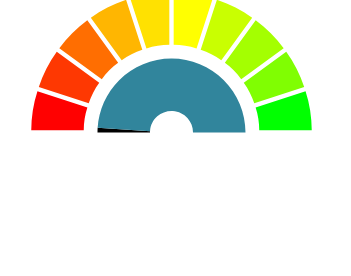
| Category | Series 0 | Series 1 |
|---|---|---|
| 0 | 0 | 10 |
| 1 | 0 | 10 |
| 2 | 2 | 10 |
| 3 | 0 | 10 |
| 4 | 98 | 10 |
| 5 | 0 | 10 |
| 6 | 0 | 10 |
| 7 | 0 | 10 |
| 8 | 0 | 10 |
| 9 | 0 | 10 |
| 10 | 100 | 100 |